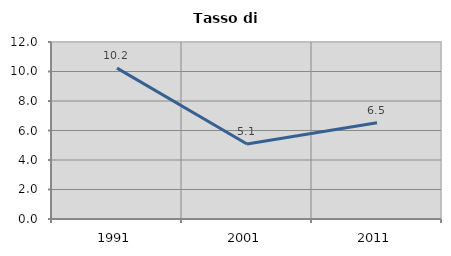
| Category | Tasso di disoccupazione   |
|---|---|
| 1991.0 | 10.232 |
| 2001.0 | 5.085 |
| 2011.0 | 6.525 |